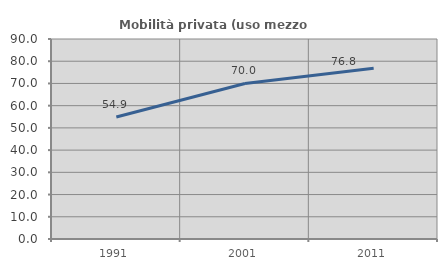
| Category | Mobilità privata (uso mezzo privato) |
|---|---|
| 1991.0 | 54.911 |
| 2001.0 | 69.975 |
| 2011.0 | 76.813 |